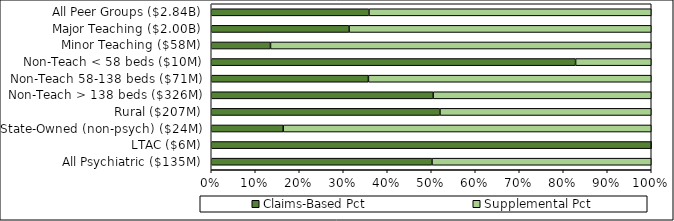
| Category | Claims-Based Pct | Supplemental Pct |
|---|---|---|
| All Peer Groups ($2.84B) | 0.358 | 0.642 |
| Major Teaching ($2.00B) | 0.313 | 0.687 |
| Minor Teaching ($58M) | 0.135 | 0.865 |
| Non-Teach < 58 beds ($10M) | 0.828 | 0.172 |
| Non-Teach 58-138 beds ($71M) | 0.357 | 0.643 |
| Non-Teach > 138 beds ($326M) | 0.504 | 0.496 |
| Rural ($207M) | 0.52 | 0.48 |
| State-Owned (non-psych) ($24M) | 0.164 | 0.836 |
| LTAC ($6M) | 1 | 0 |
| All Psychiatric ($135M) | 0.502 | 0.498 |